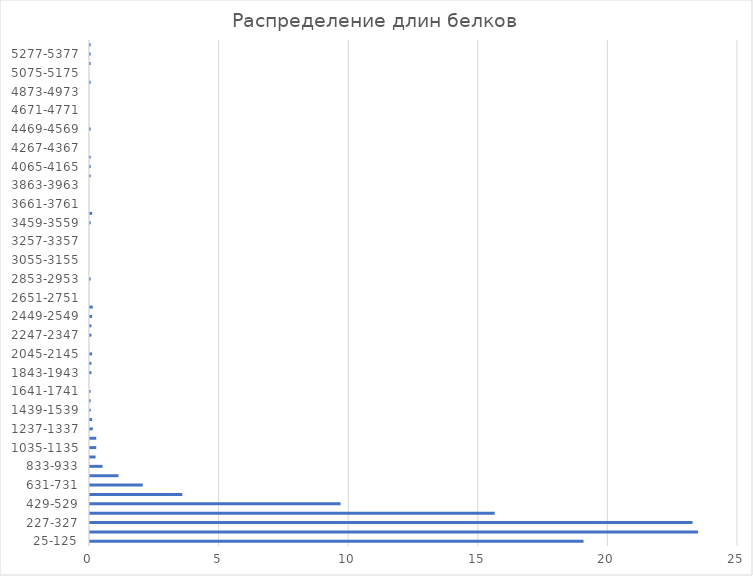
| Category | Распределение длин белков |
|---|---|
| 25-125 | 19.041 |
| 126-226 | 23.46 |
| 227-327 | 23.246 |
| 328-428 | 15.613 |
| 429-529 | 9.668 |
| 530-630 | 3.562 |
| 631-731 | 2.035 |
| 732-832 | 1.098 |
| 833-933 | 0.482 |
| 934-1034 | 0.214 |
| 1035-1135 | 0.241 |
| 1136-1236 | 0.241 |
| 1237-1337 | 0.107 |
| 1338-1438 | 0.08 |
| 1439-1539 | 0.027 |
| 1540-1640 | 0.027 |
| 1641-1741 | 0.027 |
| 1742-1842 | 0 |
| 1843-1943 | 0.054 |
| 1944-2044 | 0.054 |
| 2045-2145 | 0.08 |
| 2146-2246 | 0 |
| 2247-2347 | 0.054 |
| 2348-2448 | 0.054 |
| 2449-2549 | 0.08 |
| 2550-2650 | 0.107 |
| 2651-2751 | 0 |
| 2752-2852 | 0 |
| 2853-2953 | 0.027 |
| 2954-3054 | 0 |
| 3055-3155 | 0 |
| 3156-3256 | 0 |
| 3257-3357 | 0 |
| 3358-3458 | 0 |
| 3459-3559 | 0.027 |
| 3560-3660 | 0.08 |
| 3661-3761 | 0 |
| 3762-3862 | 0 |
| 3863-3963 | 0 |
| 3964-4064 | 0.027 |
| 4065-4165 | 0.027 |
| 4166-4266 | 0.027 |
| 4267-4367 | 0 |
| 4368-4468 | 0 |
| 4469-4569 | 0.027 |
| 4570-4670 | 0 |
| 4671-4771 | 0 |
| 4772-4872 | 0 |
| 4873-4973 | 0 |
| 4974-5074 | 0.027 |
| 5075-5175 | 0 |
| 5176-5276 | 0.027 |
| 5277-5377 | 0.027 |
| 5378-5432 | 0.027 |